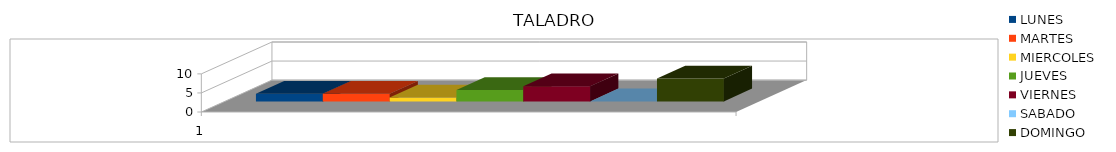
| Category | LUNES | MARTES | MIERCOLES | JUEVES | VIERNES  | SABADO | DOMINGO |
|---|---|---|---|---|---|---|---|
| 0 | 2 | 2 | 1 | 3 | 4 | 0 | 6 |